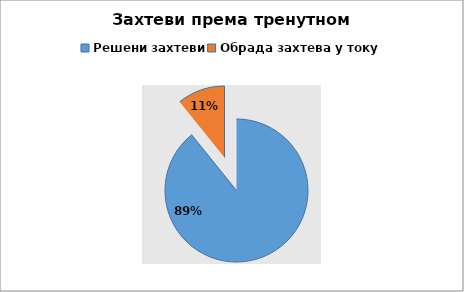
| Category | Series 0 |
|---|---|
| Решени захтеви | 25357 |
| Обрада захтева у току | 3070 |